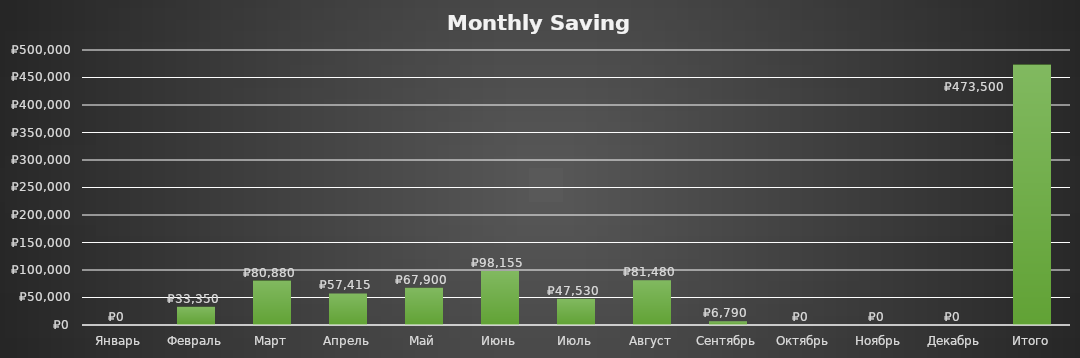
| Category | Final saving |
|---|---|
| Январь | 0 |
| Февраль | 33350 |
| Март | 80880 |
| Апрель | 57415 |
| Май | 67900 |
| Июнь | 98155 |
| Июль | 47530 |
| Август | 81480 |
| Сентябрь | 6790 |
| Октябрь | 0 |
| Ноябрь | 0 |
| Декабрь | 0 |
| Итого | 473500 |